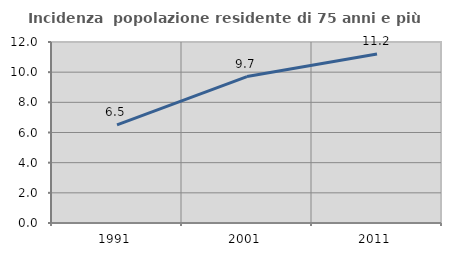
| Category | Incidenza  popolazione residente di 75 anni e più |
|---|---|
| 1991.0 | 6.506 |
| 2001.0 | 9.71 |
| 2011.0 | 11.209 |